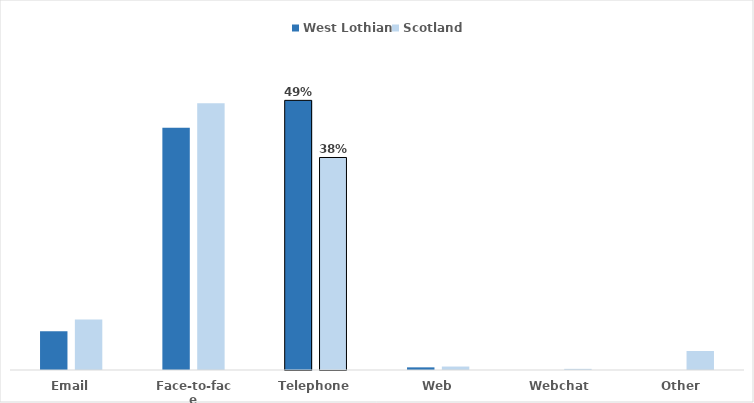
| Category | West Lothian | Scotland |
|---|---|---|
| Email | 0.07 | 0.091 |
| Face-to-face | 0.438 | 0.482 |
| Telephone | 0.487 | 0.384 |
| Web | 0.005 | 0.006 |
| Webchat | 0 | 0.002 |
| Other | 0 | 0.034 |